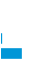
| Category | Series 0 |
|---|---|
| 0 | 0 |
| 1 | 0 |
| 2 | 0.008 |
| 3 | 0.992 |